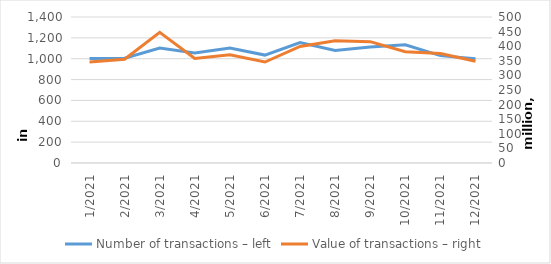
| Category | Number of transactions – left |
|---|---|
| 1/2021 | 1002797 |
| 2/2021 | 1005039 |
| 3/2021 | 1102199 |
| 4/2021 | 1054891 |
| 5/2021 | 1103572 |
| 6/2021 | 1034895 |
| 7/2021 | 1155761 |
| 8/2021 | 1078996 |
| 9/2021 | 1113305 |
| 10/2021 | 1133192 |
| 11/2021 | 1029504 |
| 12/2021 | 999425 |